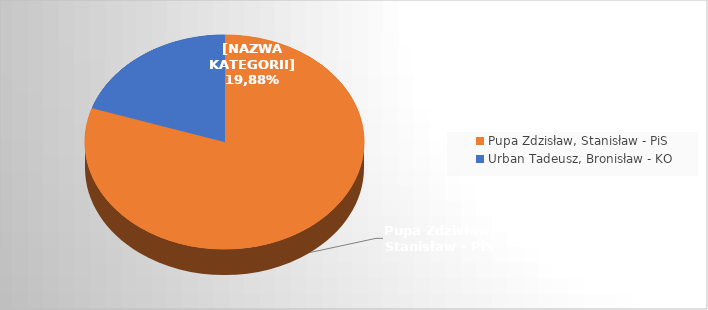
| Category | Series 0 |
|---|---|
| Pupa Zdzisław, Stanisław - PiS | 0.801 |
| Urban Tadeusz, Bronisław - KO | 0.199 |